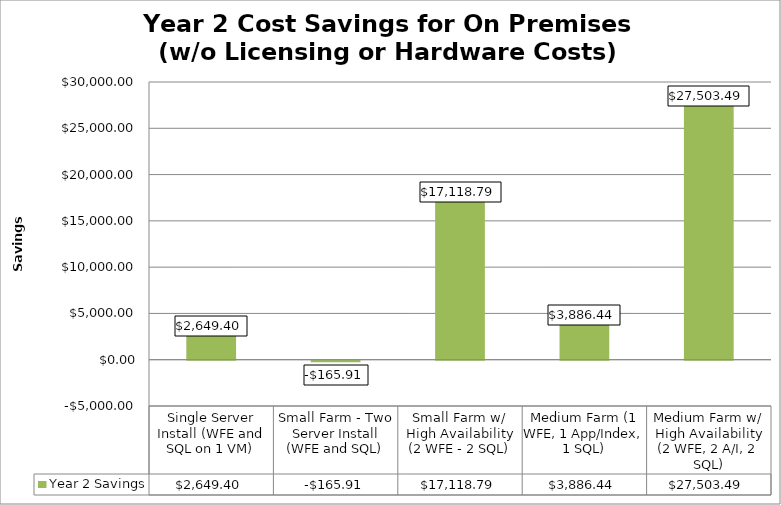
| Category | Year 2 Savings |
|---|---|
| Single Server Install (WFE and SQL on 1 VM) | 2649.396 |
| Small Farm - Two Server Install (WFE and SQL) | -165.906 |
| Small Farm w/ High Availability (2 WFE - 2 SQL) | 17118.792 |
| Medium Farm (1 WFE, 1 App/Index, 1 SQL) | 3886.443 |
| Medium Farm w/ High Availability (2 WFE, 2 A/I, 2 SQL) | 27503.49 |